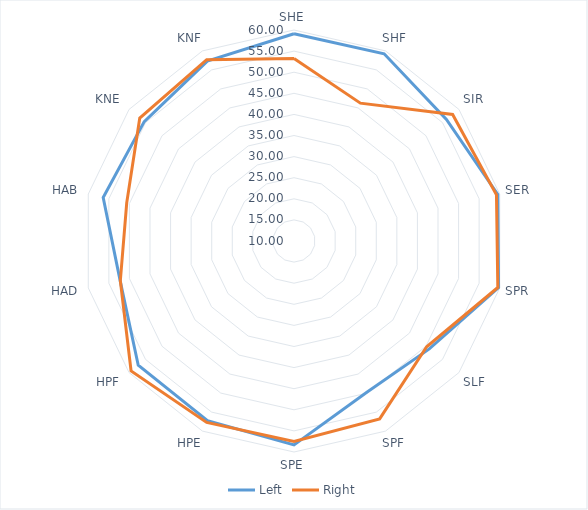
| Category | Left | Right |
|---|---|---|
| SHE | 59.11 | 53.26 |
| SHF | 59.23 | 46.25 |
| SIR | 56.2 | 58.08 |
| SER | 59.53 | 59.21 |
| SPR | 59.72 | 59.54 |
| SLF | 51 | 50.2 |
| SPF | 49.78 | 56.78 |
| SPE | 58.31 | 57.51 |
| HPE | 57.26 | 57.71 |
| HPF | 57.21 | 59.38 |
| HAD | 52.26 | 52.21 |
| HAB | 56.38 | 50.66 |
| KNE | 55.39 | 56.75 |
| KNF | 57.33 | 57.7 |